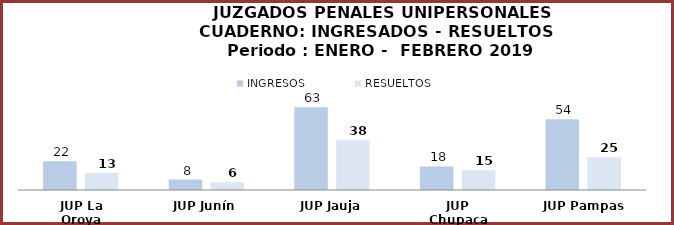
| Category | INGRESOS | RESUELTOS |
|---|---|---|
| JUP La Oroya | 22 | 13 |
| JUP Junín | 8 | 6 |
| JUP Jauja | 63 | 38 |
| JUP Chupaca | 18 | 15 |
| JUP Pampas | 54 | 25 |